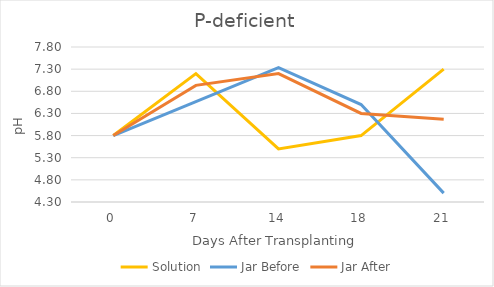
| Category | Solution | Jar Before | Jar After |
|---|---|---|---|
| 0.0 | 5.8 | 5.8 | 5.8 |
| 7.0 | 7.2 | 6.567 | 6.933 |
| 14.0 | 5.5 | 7.333 | 7.2 |
| 18.0 | 5.8 | 6.5 | 6.3 |
| 21.0 | 7.3 | 4.5 | 6.167 |